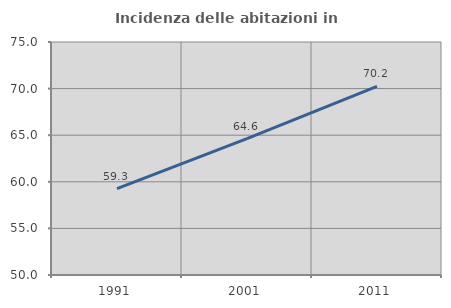
| Category | Incidenza delle abitazioni in proprietà  |
|---|---|
| 1991.0 | 59.267 |
| 2001.0 | 64.626 |
| 2011.0 | 70.243 |